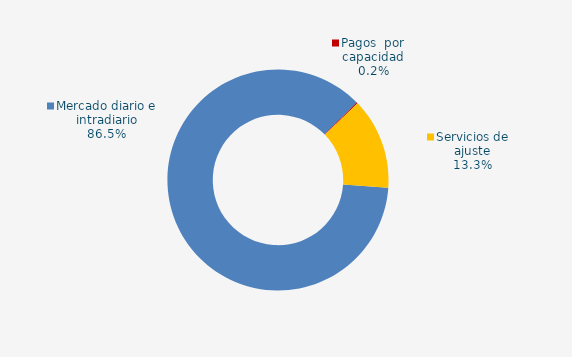
| Category | Series 0 |
|---|---|
| Mercado diario e intradiario | 90.93 |
| Pagos  por capacidad | 0.16 |
| Mecanismo ajuste RD-L 10/2022 | 0 |
| Servicios de ajuste | 14.01 |